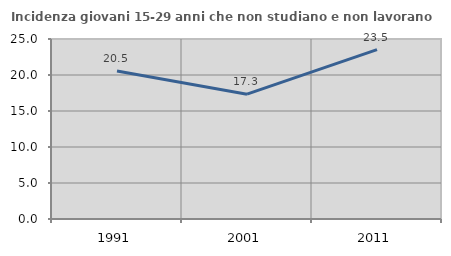
| Category | Incidenza giovani 15-29 anni che non studiano e non lavorano  |
|---|---|
| 1991.0 | 20.548 |
| 2001.0 | 17.333 |
| 2011.0 | 23.529 |